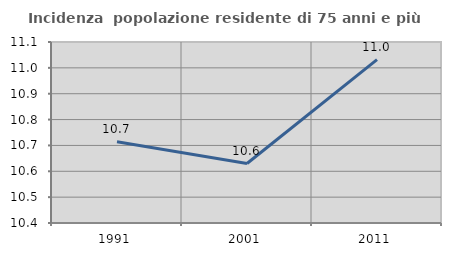
| Category | Incidenza  popolazione residente di 75 anni e più |
|---|---|
| 1991.0 | 10.714 |
| 2001.0 | 10.63 |
| 2011.0 | 11.032 |